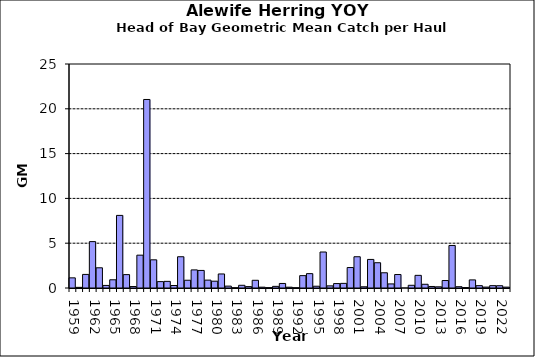
| Category | Series 0 |
|---|---|
| 1959.0 | 1.133 |
| 1960.0 | 0.072 |
| 1961.0 | 1.516 |
| 1962.0 | 5.177 |
| 1963.0 | 2.256 |
| 1964.0 | 0.286 |
| 1965.0 | 0.916 |
| 1966.0 | 8.103 |
| 1967.0 | 1.494 |
| 1968.0 | 0.163 |
| 1969.0 | 3.665 |
| 1970.0 | 21.041 |
| 1971.0 | 3.145 |
| 1972.0 | 0.712 |
| 1973.0 | 0.741 |
| 1974.0 | 0.279 |
| 1975.0 | 3.489 |
| 1976.0 | 0.866 |
| 1977.0 | 2.02 |
| 1978.0 | 1.962 |
| 1979.0 | 0.879 |
| 1980.0 | 0.76 |
| 1981.0 | 1.567 |
| 1982.0 | 0.211 |
| 1983.0 | 0.017 |
| 1984.0 | 0.303 |
| 1985.0 | 0.155 |
| 1986.0 | 0.861 |
| 1987.0 | 0.092 |
| 1988.0 | 0.034 |
| 1989.0 | 0.182 |
| 1990.0 | 0.507 |
| 1991.0 | 0.089 |
| 1992.0 | 0.017 |
| 1993.0 | 1.381 |
| 1994.0 | 1.604 |
| 1995.0 | 0.199 |
| 1996.0 | 4.018 |
| 1997.0 | 0.238 |
| 1998.0 | 0.494 |
| 1999.0 | 0.518 |
| 2000.0 | 2.284 |
| 2001.0 | 3.488 |
| 2002.0 | 0.136 |
| 2003.0 | 3.189 |
| 2004.0 | 2.82 |
| 2005.0 | 1.699 |
| 2006.0 | 0.457 |
| 2007.0 | 1.504 |
| 2008.0 | 0 |
| 2009.0 | 0.302 |
| 2010.0 | 1.411 |
| 2011.0 | 0.416 |
| 2012.0 | 0.17 |
| 2013.0 | 0.133 |
| 2014.0 | 0.834 |
| 2015.0 | 4.747 |
| 2016.0 | 0.144 |
| 2017.0 | 0.044 |
| 2018.0 | 0.905 |
| 2019.0 | 0.262 |
| 2020.0 | 0.1 |
| 2021.0 | 0.263 |
| 2022.0 | 0.255 |
| 2023.0 | 0.097 |